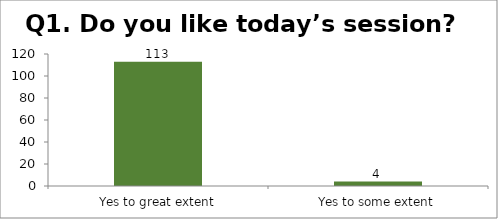
| Category | Q1. Do you like today’s session? |
|---|---|
| Yes to great extent | 113 |
| Yes to some extent | 4 |